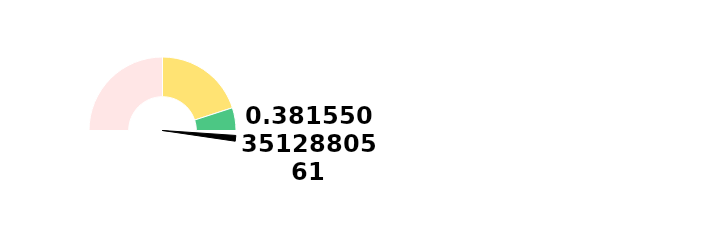
| Category | Ponteiro |
|---|---|
| 0 | 104.37 |
| 1 | 2.5 |
| 2 | 93.13 |